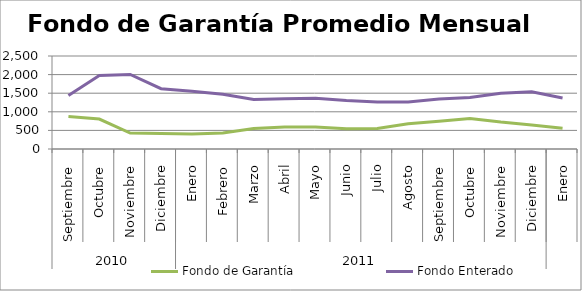
| Category | Fondo de Garantía | Fondo Enterado |
|---|---|---|
| 0 | 871.43 | 1439.553 |
| 1 | 804.208 | 1973.732 |
| 2 | 428.758 | 2004.096 |
| 3 | 417.974 | 1620.905 |
| 4 | 403.651 | 1555.632 |
| 5 | 429.02 | 1474.054 |
| 6 | 551.344 | 1328.521 |
| 7 | 591.732 | 1351.463 |
| 8 | 591.784 | 1363.301 |
| 9 | 544.875 | 1304.985 |
| 10 | 551.606 | 1265.502 |
| 11 | 679.839 | 1266.018 |
| 12 | 747.74 | 1344.929 |
| 13 | 819.75 | 1383.171 |
| 14 | 723.635 | 1501.378 |
| 15 | 648.288 | 1537.485 |
| 16 | 560.173 | 1370.992 |